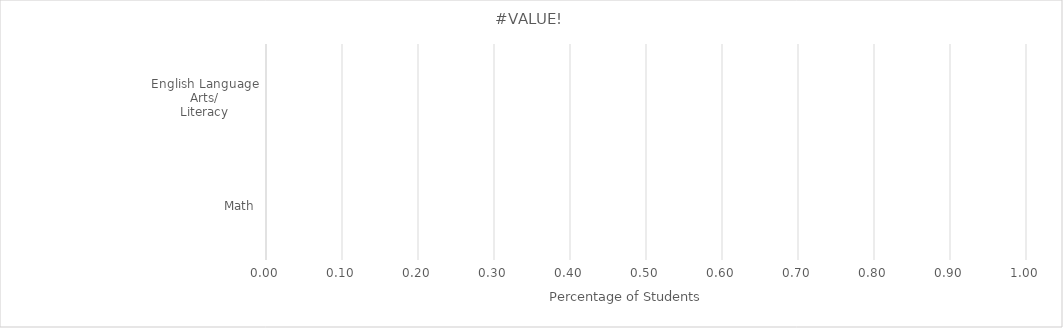
| Category | Benchmark | Entire LEA  | Title IV-A Identified Schools |
|---|---|---|---|
| English Language Arts/
Literacy | 0 | 0 | 0 |
| Math | 0 | 0 | 0 |